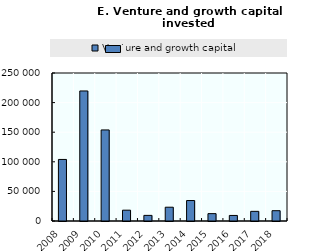
| Category | Venture and growth capital |
|---|---|
| 2008.0 | 103986 |
| 2009.0 | 219659 |
| 2010.0 | 153843 |
| 2011.0 | 18284 |
| 2012.0 | 9492 |
| 2013.0 | 23298 |
| 2014.0 | 34557 |
| 2015.0 | 12433 |
| 2016.0 | 9378 |
| 2017.0 | 16306 |
| 2018.0 | 17405 |